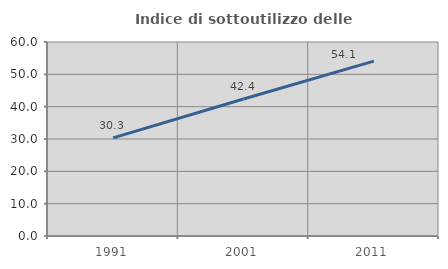
| Category | Indice di sottoutilizzo delle abitazioni  |
|---|---|
| 1991.0 | 30.337 |
| 2001.0 | 42.373 |
| 2011.0 | 54.088 |